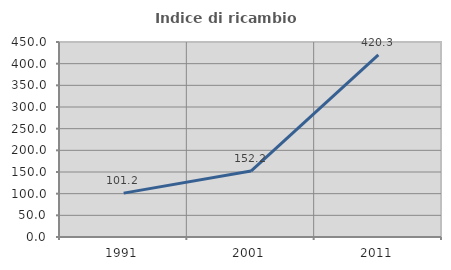
| Category | Indice di ricambio occupazionale  |
|---|---|
| 1991.0 | 101.235 |
| 2001.0 | 152.191 |
| 2011.0 | 420.301 |